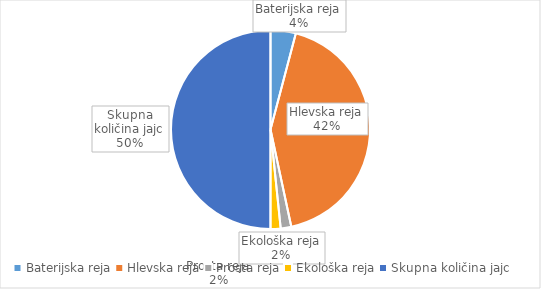
| Category | Količina kosov jajc |
|---|---|
| Baterijska reja | 276285 |
| Hlevska reja | 2863295 |
| Prosta reja | 115814 |
| Ekološka reja | 110080 |
| Skupna količina jajc | 3365474 |